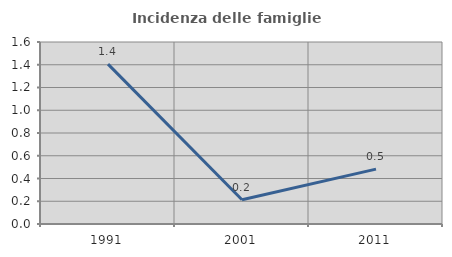
| Category | Incidenza delle famiglie numerose |
|---|---|
| 1991.0 | 1.405 |
| 2001.0 | 0.213 |
| 2011.0 | 0.483 |